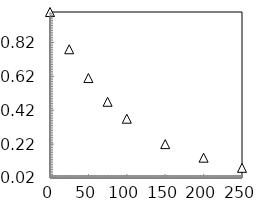
| Category | Series 2 |
|---|---|
| 0.0 | 1 |
| 25.0 | 0.78 |
| 50.0 | 0.61 |
| 75.0 | 0.47 |
| 100.0 | 0.37 |
| 150.0 | 0.22 |
| 200.0 | 0.14 |
| 250.0 | 0.08 |